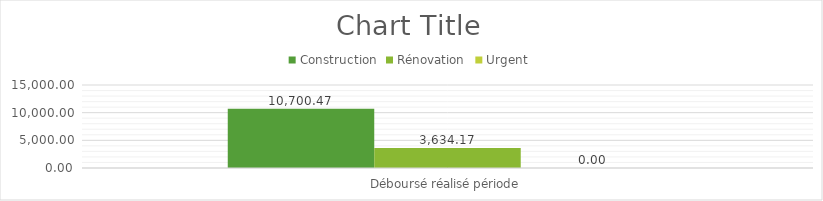
| Category | Construction | Rénovation | Urgent |
|---|---|---|---|
| Déboursé réalisé période | 10700.47 | 3634.169 | 0 |